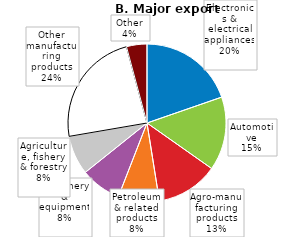
| Category | Series 0 |
|---|---|
| Electronics & electrical appliances | 19.692 |
| Automotive | 15.074 |
| Agro-manufacturing products | 12.719 |
| Petroleum & 
related products | 8.414 |
| Machinery & equipment | 8.357 |
| Agriculture, fishery & forestry | 8.038 |
| Other manufacturing products | 23.52 |
| Other | 4.186 |